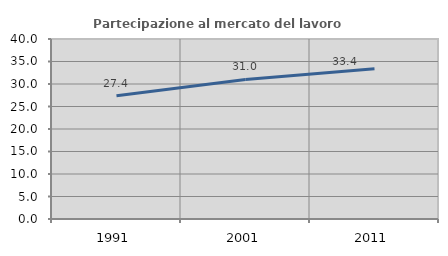
| Category | Partecipazione al mercato del lavoro  femminile |
|---|---|
| 1991.0 | 27.398 |
| 2001.0 | 31.004 |
| 2011.0 | 33.377 |